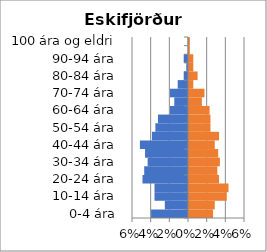
| Category | % karlar | %konur |
|---|---|---|
| 0-4 ára | -0.04 | 0.026 |
| 5-9 ára | -0.025 | 0.028 |
| 10-14 ára | -0.036 | 0.04 |
| 15-19 ára | -0.036 | 0.042 |
| 20-24 ára | -0.049 | 0.032 |
| 25-29 ára | -0.047 | 0.03 |
| 30-34 ára | -0.043 | 0.033 |
| 35-39 ára | -0.046 | 0.031 |
| 40-44 ára | -0.052 | 0.028 |
| 45-49 ára | -0.039 | 0.032 |
| 50-54 ára | -0.035 | 0.023 |
| 55-59 ára | -0.032 | 0.023 |
| 60-64 ára | -0.019 | 0.022 |
| 65-69 ára | -0.015 | 0.014 |
| 70-74 ára | -0.019 | 0.017 |
| 75-79 ára | -0.011 | 0.005 |
| 80-84 ára | -0.005 | 0.009 |
| 85-89 ára | -0.002 | 0.005 |
| 90-94 ára | -0.005 | 0.005 |
| 95-99 ára | 0 | 0.001 |
| 100 ára og eldri | 0 | 0.001 |